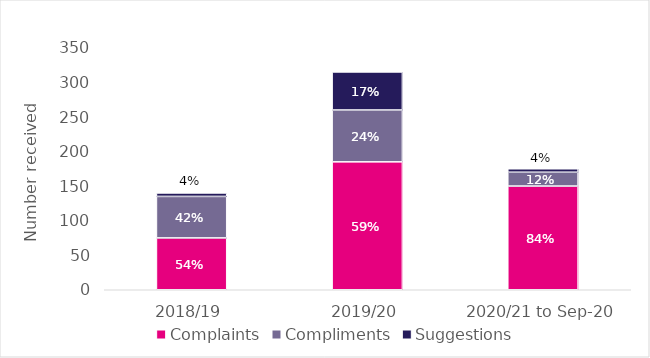
| Category | Complaints | Compliments | Suggestions |
|---|---|---|---|
| 2018/19 | 75 | 60 | 5 |
| 2019/20 | 185 | 75 | 55 |
| 2020/21 to Sep-20 | 150 | 20 | 5 |